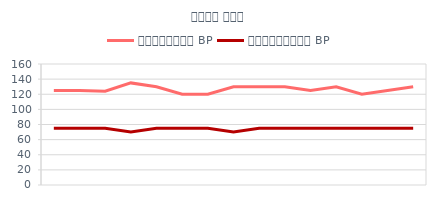
| Category | प्रकुंचक BP | अनुशिथिलक BP |
|---|---|---|
| 6/1/12 | 125 | 75 |
| 6/2/12 | 125 | 75 |
| 6/3/12 | 124 | 75 |
| 6/4/12 | 135 | 70 |
| 6/5/12 | 130 | 75 |
| 6/6/12 | 120 | 75 |
| 6/7/12 | 120 | 75 |
| 6/8/12 | 130 | 70 |
| 6/9/12 | 130 | 75 |
| 6/10/12 | 130 | 75 |
| 6/11/12 | 125 | 75 |
| 6/12/12 | 130 | 75 |
| 6/13/12 | 120 | 75 |
| 6/14/12 | 125 | 75 |
| 6/15/12 | 130 | 75 |